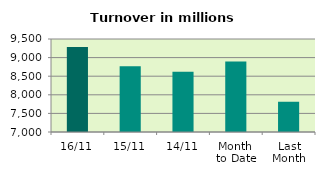
| Category | Series 0 |
|---|---|
| 16/11 | 9286.052 |
| 15/11 | 8767.305 |
| 14/11 | 8621.185 |
| Month 
to Date | 8892.26 |
| Last
Month | 7813.06 |